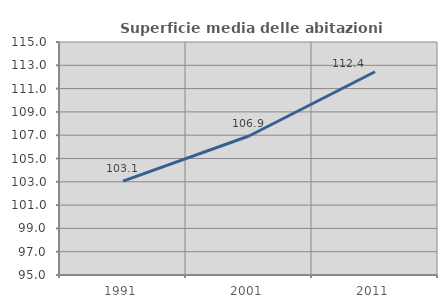
| Category | Superficie media delle abitazioni occupate |
|---|---|
| 1991.0 | 103.056 |
| 2001.0 | 106.929 |
| 2011.0 | 112.445 |